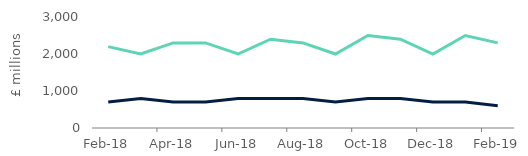
| Category | House purchase | Remortgage |
|---|---|---|
| 2018-02-01 | 700 | 2200 |
| 2018-03-01 | 800 | 2000 |
| 2018-04-01 | 700 | 2300 |
| 2018-05-01 | 700 | 2300 |
| 2018-06-01 | 800 | 2000 |
| 2018-07-01 | 800 | 2400 |
| 2018-08-01 | 800 | 2300 |
| 2018-09-01 | 700 | 2000 |
| 2018-10-01 | 800 | 2500 |
| 2018-11-01 | 800 | 2400 |
| 2018-12-01 | 700 | 2000 |
| 2019-01-01 | 700 | 2500 |
| 2019-02-01 | 600 | 2300 |